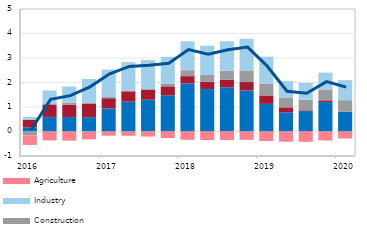
| Category | Other sectors | Trade | Construction | Industry | Agriculture |
|---|---|---|---|---|---|
| 2016 | 0.163 | 0.321 | -0.156 | 0.113 | -0.39 |
| II | 0.595 | 0.508 | 0.015 | 0.558 | -0.363 |
| III | 0.594 | 0.494 | 0.088 | 0.66 | -0.372 |
| IV | 0.585 | 0.553 | 0.046 | 0.96 | -0.322 |
| 2017 | 0.945 | 0.413 | 0.049 | 1.121 | -0.172 |
| II | 1.216 | 0.424 | 0.032 | 1.158 | -0.174 |
| III | 1.297 | 0.414 | 0.02 | 1.182 | -0.205 |
| IV | 1.478 | 0.366 | 0.113 | 1.094 | -0.268 |
| 2018 | 1.962 | 0.298 | 0.242 | 1.18 | -0.338 |
| II | 1.736 | 0.292 | 0.281 | 1.193 | -0.346 |
| III | 1.803 | 0.311 | 0.372 | 1.197 | -0.349 |
| IV | 1.675 | 0.344 | 0.476 | 1.293 | -0.341 |
| 2019 | 1.127 | 0.345 | 0.485 | 1.097 | -0.39 |
| II | 0.785 | 0.202 | 0.402 | 0.668 | -0.414 |
| III | 0.834 | 0.029 | 0.43 | 0.691 | -0.42 |
| IV | 1.2 | 0.072 | 0.444 | 0.687 | -0.366 |
| 2020 | 0.799 | 0.004 | 0.477 | 0.817 | -0.286 |